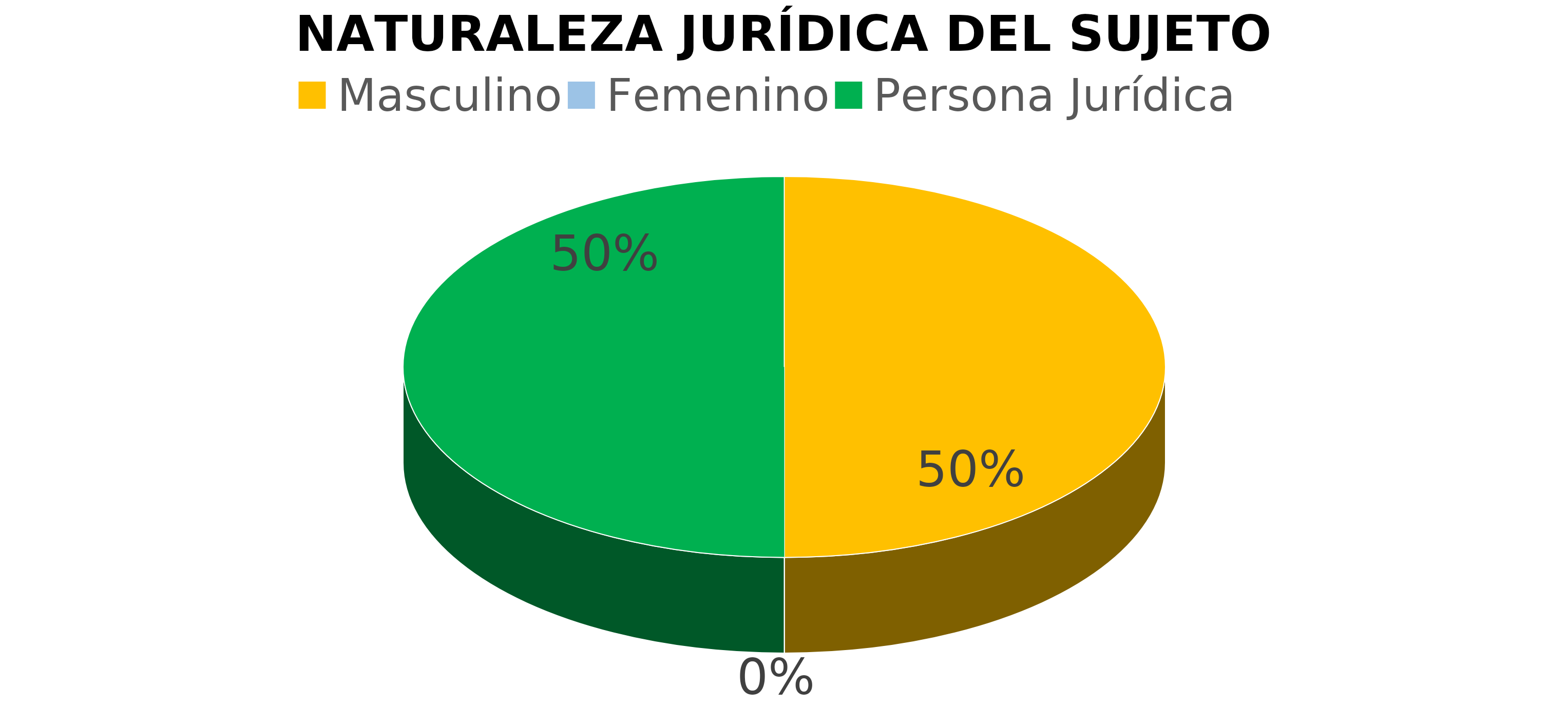
| Category | Series 0 |
|---|---|
| Masculino | 1 |
| Femenino | 0 |
| Persona Jurídica | 1 |